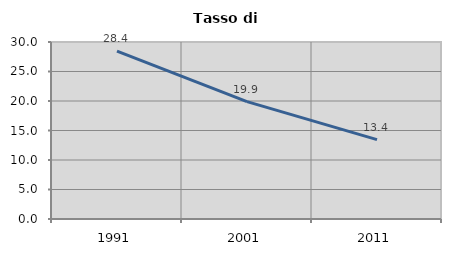
| Category | Tasso di disoccupazione   |
|---|---|
| 1991.0 | 28.45 |
| 2001.0 | 19.889 |
| 2011.0 | 13.445 |